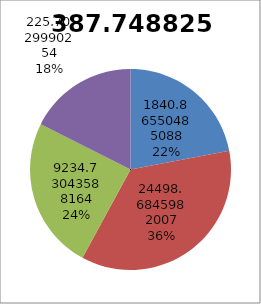
| Category | 387.7488253 |
|---|---|
| 1840.86550485088 | 11054.107 |
| 24498.6845982007 | 18038.864 |
| 9234.73043588164 | 12300.872 |
| 225.7029990254 | 8824.303 |